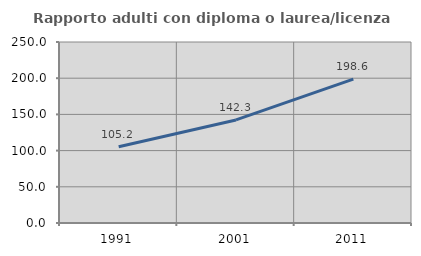
| Category | Rapporto adulti con diploma o laurea/licenza media  |
|---|---|
| 1991.0 | 105.209 |
| 2001.0 | 142.333 |
| 2011.0 | 198.63 |